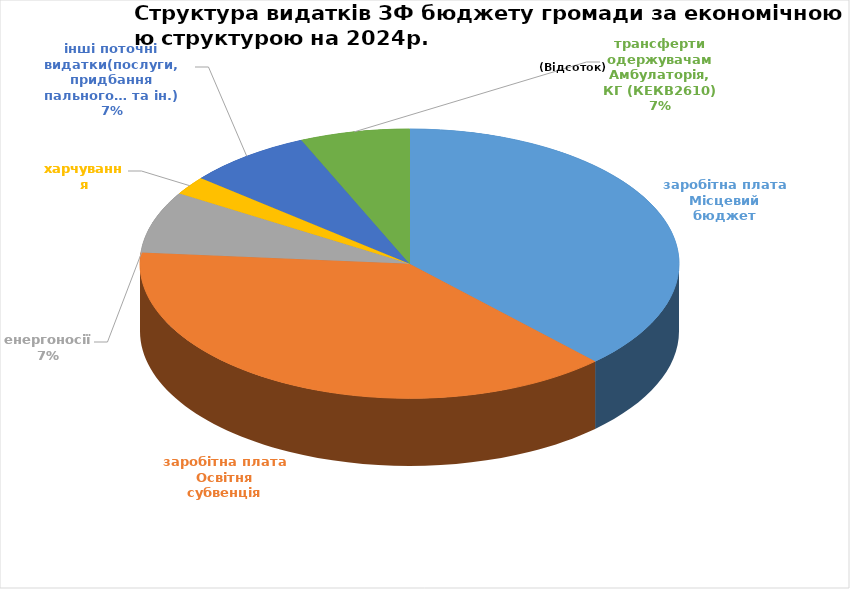
| Category | Series 0 | Series 1 |
|---|---|---|
| заробітна плата Місцевий бюджет | 12797693 | 37.91 |
| заробітна плата Освітня субвенція | 12965900 | 38.409 |
| енергоносії  | 2496402 | 7.395 |
| харчування | 750000 | 2.222 |
| інші поточні видатки(послуги, придбання пального… та ін.) | 2530445 | 7.496 |
| трансферти одержувачам Амбулаторія, КГ (КЕКВ2610) | 2217234 | 6.568 |